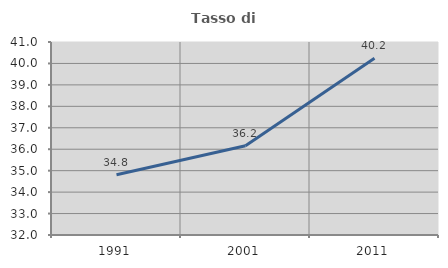
| Category | Tasso di occupazione   |
|---|---|
| 1991.0 | 34.81 |
| 2001.0 | 36.164 |
| 2011.0 | 40.242 |